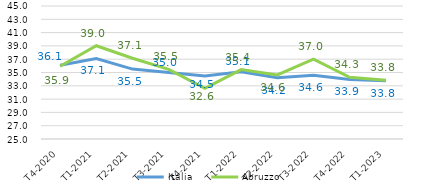
| Category | Italia | Abruzzo |
|---|---|---|
|   T4-2020 | 36.104 | 35.935 |
|   T1-2021 | 37.107 | 39.023 |
|   T2-2021 | 35.509 | 37.138 |
|   T3-2021 | 34.983 | 35.478 |
|   T4-2021 | 34.464 | 32.62 |
|   T1-2022 | 35.127 | 35.444 |
|   T2-2022 | 34.205 | 34.625 |
|   T3-2022 | 34.586 | 37.024 |
|   T4-2022 | 33.949 | 34.286 |
|   T1-2023 | 33.774 | 33.82 |